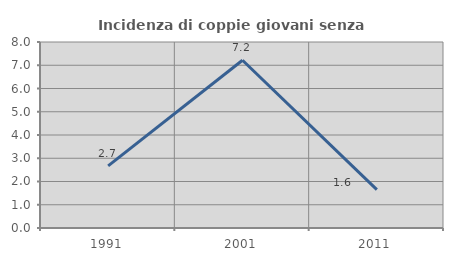
| Category | Incidenza di coppie giovani senza figli |
|---|---|
| 1991.0 | 2.674 |
| 2001.0 | 7.216 |
| 2011.0 | 1.648 |